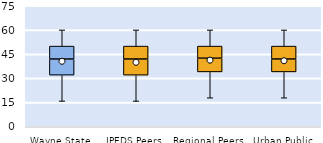
| Category | 25th | 50th | 75th |
|---|---|---|---|
| Wayne State | 32 | 10 | 8 |
| IPEDS Peers | 32 | 10 | 8 |
| Regional Peers | 34 | 8.5 | 7.5 |
| Urban Public | 34 | 8 | 8 |